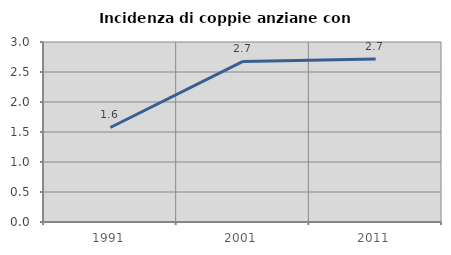
| Category | Incidenza di coppie anziane con figli |
|---|---|
| 1991.0 | 1.576 |
| 2001.0 | 2.677 |
| 2011.0 | 2.716 |